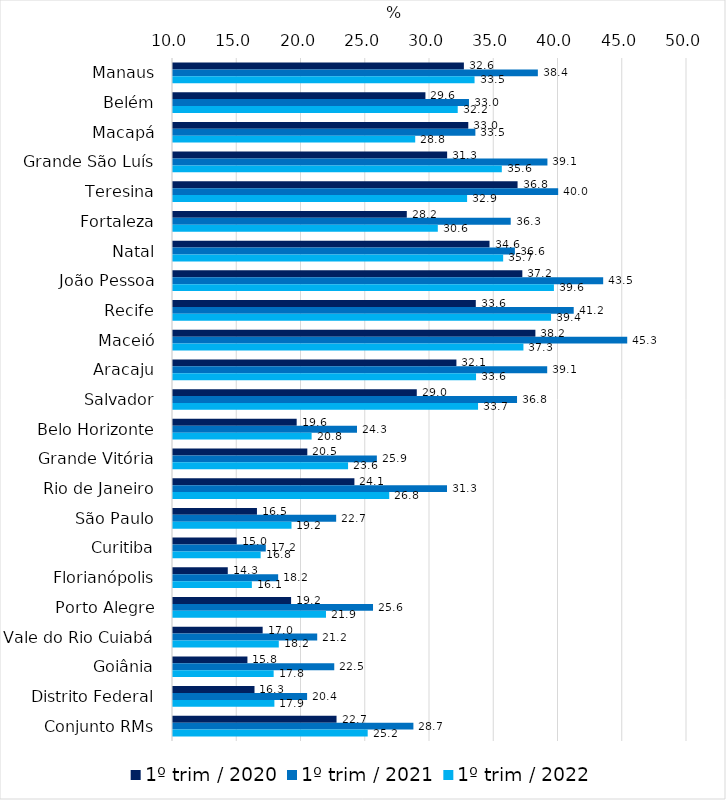
| Category | 1º trim / 2020 | 1º trim / 2021 | 1º trim / 2022 |
|---|---|---|---|
| Manaus | 32.637 | 38.393 | 33.468 |
| Belém | 29.644 | 33.032 | 32.158 |
| Macapá | 32.98 | 33.531 | 28.849 |
| Grande São Luís | 31.334 | 39.138 | 35.589 |
| Teresina | 36.815 | 39.975 | 32.888 |
| Fortaleza | 28.194 | 36.281 | 30.608 |
| Natal | 34.632 | 36.607 | 35.694 |
| João Pessoa | 37.186 | 43.477 | 39.643 |
| Recife | 33.564 | 41.184 | 39.42 |
| Maceió | 38.202 | 45.348 | 37.271 |
| Aracaju | 32.056 | 39.121 | 33.583 |
| Salvador | 28.971 | 36.774 | 33.74 |
| Belo Horizonte | 19.624 | 24.319 | 20.788 |
| Grande Vitória | 20.452 | 25.865 | 23.624 |
| Rio de Janeiro | 24.118 | 31.323 | 26.827 |
| São Paulo | 16.533 | 22.697 | 19.221 |
| Curitiba | 14.956 | 17.221 | 16.82 |
| Florianópolis | 14.263 | 18.183 | 16.137 |
| Porto Alegre | 19.19 | 25.566 | 21.905 |
| Vale do Rio Cuiabá | 16.977 | 21.223 | 18.233 |
| Goiânia | 15.792 | 22.549 | 17.833 |
| Distrito Federal | 16.342 | 20.436 | 17.89 |
| Conjunto RMs | 22.727 | 28.708 | 25.152 |